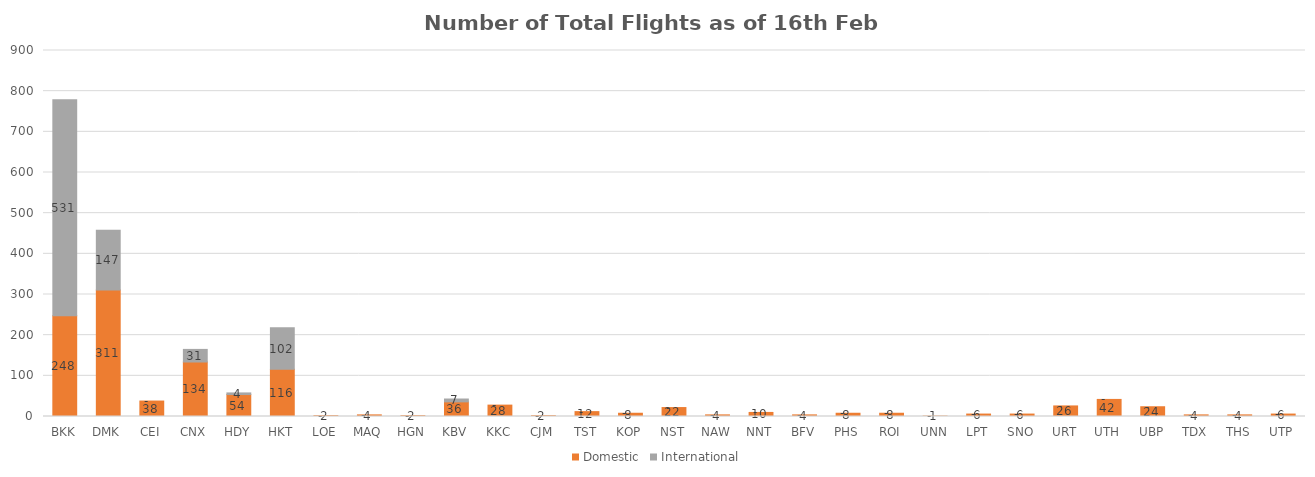
| Category | Domestic | International |
|---|---|---|
| BKK | 248 | 531 |
| DMK | 311 | 147 |
| CEI | 38 | 0 |
| CNX | 134 | 31 |
| HDY | 54 | 4 |
| HKT | 116 | 102 |
| LOE | 2 | 0 |
| MAQ | 4 | 0 |
| HGN | 2 | 0 |
| KBV | 36 | 7 |
| KKC | 28 | 0 |
| CJM | 2 | 0 |
| TST | 12 | 0 |
| KOP | 8 | 0 |
| NST | 22 | 0 |
| NAW | 4 | 0 |
| NNT | 10 | 0 |
| BFV | 4 | 0 |
| PHS | 8 | 0 |
| ROI | 8 | 0 |
| UNN | 1 | 0 |
| LPT | 6 | 0 |
| SNO | 6 | 0 |
| URT | 26 | 0 |
| UTH | 42 | 0 |
| UBP | 24 | 0 |
| TDX | 4 | 0 |
| THS | 4 | 0 |
| UTP | 6 | 0 |